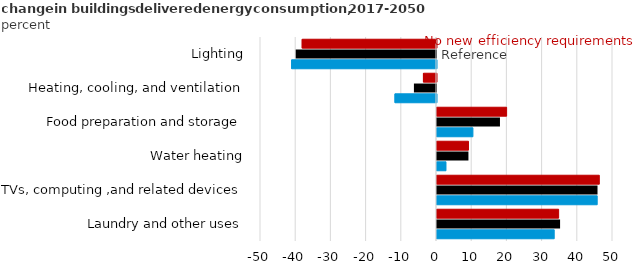
| Category | New efficiency requirements | Reference | No new efficiency requirements |
|---|---|---|---|
| Laundry and other uses | 33.297 | 34.967 | 34.554 |
| TVs, computing ,and related devices | 45.51 | 45.601 | 46.108 |
| Water heating | 2.551 | 8.932 | 8.941 |
| Food preparation and storage | 10.202 | 17.886 | 19.779 |
| Heating, cooling, and ventilation | -11.788 | -6.274 | -3.711 |
| Lighting | -41.145 | -39.855 | -38.149 |